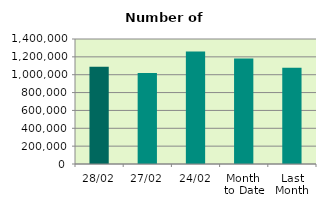
| Category | Series 0 |
|---|---|
| 28/02 | 1087808 |
| 27/02 | 1020150 |
| 24/02 | 1259860 |
| Month 
to Date | 1180310.4 |
| Last
Month | 1077187.636 |